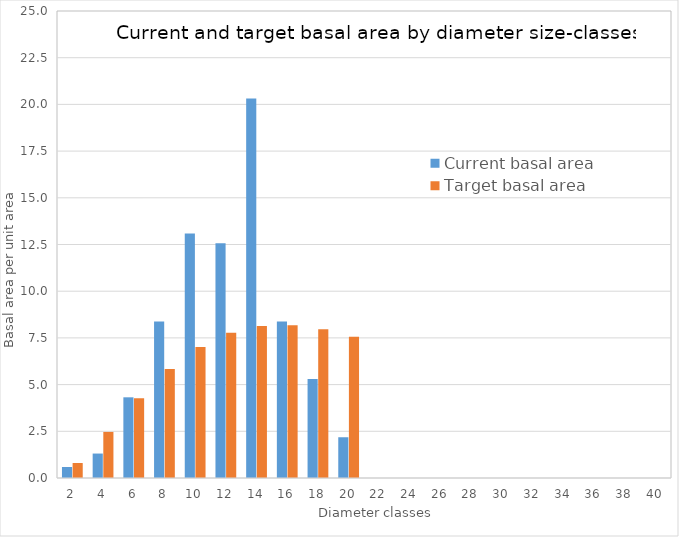
| Category | Current basal area | Target basal area |
|---|---|---|
| 2.0 | 0.589 | 0.802 |
| 4.0 | 1.309 | 2.467 |
| 6.0 | 4.32 | 4.269 |
| 8.0 | 8.378 | 5.838 |
| 10.0 | 13.09 | 7.017 |
| 12.0 | 12.566 | 7.773 |
| 14.0 | 20.311 | 8.138 |
| 16.0 | 8.378 | 8.176 |
| 18.0 | 5.301 | 7.96 |
| 20.0 | 2.182 | 7.56 |
| 22.0 | 0 | 0 |
| 24.0 | 0 | 0 |
| 26.0 | 0 | 0 |
| 28.0 | 0 | 0 |
| 30.0 | 0 | 0 |
| 32.0 | 0 | 0 |
| 34.0 | 0 | 0 |
| 36.0 | 0 | 0 |
| 38.0 | 0 | 0 |
| 40.0 | 0 | 0 |